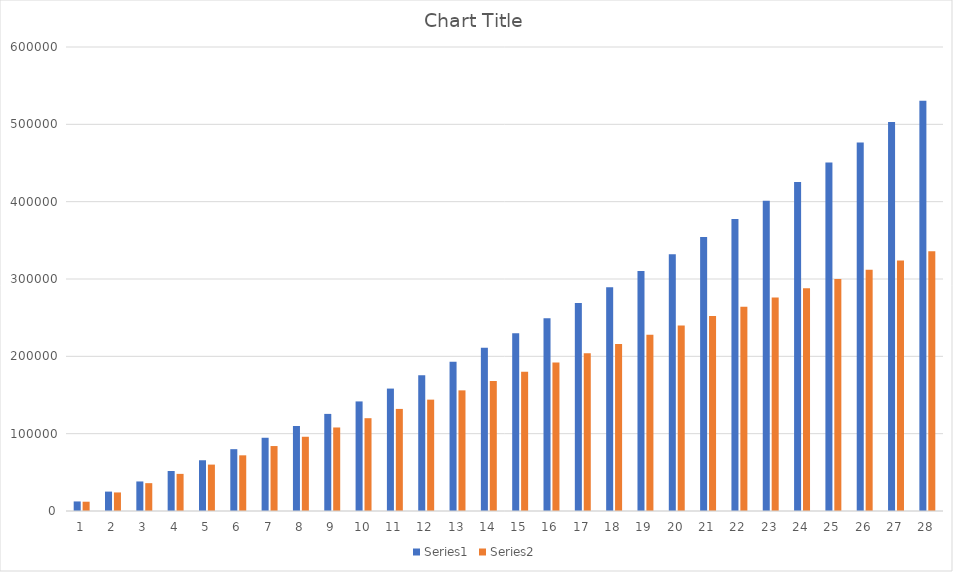
| Category | Series 0 | Series 1 |
|---|---|---|
| 0 | 12360 | 12000 |
| 1 | 25091 | 24000 |
| 2 | 38204 | 36000 |
| 3 | 51710 | 48000 |
| 4 | 65621 | 60000 |
| 5 | 79950 | 72000 |
| 6 | 94709 | 84000 |
| 7 | 109910 | 96000 |
| 8 | 125567 | 108000 |
| 9 | 141694 | 120000 |
| 10 | 158305 | 132000 |
| 11 | 175414 | 144000 |
| 12 | 193036 | 156000 |
| 13 | 211187 | 168000 |
| 14 | 229883 | 180000 |
| 15 | 249139 | 192000 |
| 16 | 268973 | 204000 |
| 17 | 289402 | 216000 |
| 18 | 310444 | 228000 |
| 19 | 332117 | 240000 |
| 20 | 354441 | 252000 |
| 21 | 377434 | 264000 |
| 22 | 401117 | 276000 |
| 23 | 425511 | 288000 |
| 24 | 450636 | 300000 |
| 25 | 476515 | 312000 |
| 26 | 503170 | 324000 |
| 27 | 530625 | 336000 |